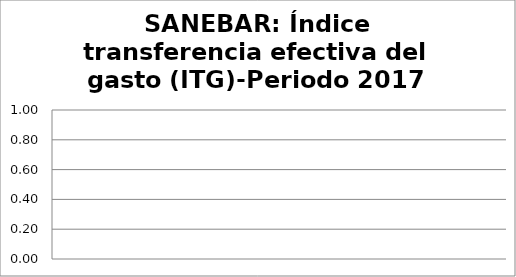
| Category | Índice transferencia efectiva del gasto (ITG) |
|---|---|
| 0 | 0 |